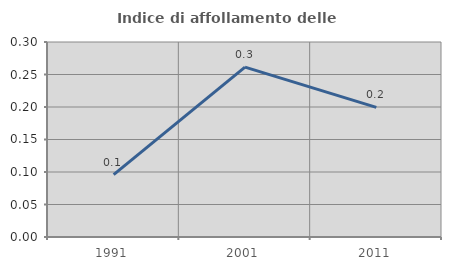
| Category | Indice di affollamento delle abitazioni  |
|---|---|
| 1991.0 | 0.096 |
| 2001.0 | 0.261 |
| 2011.0 | 0.199 |